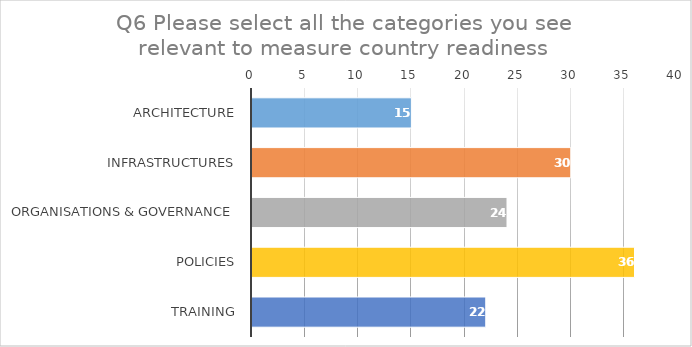
| Category | Series 0 |
|---|---|
| Architecture | 15 |
| Infrastructures | 30 |
| Organisations & Governance | 24 |
| Policies | 36 |
| Training | 22 |